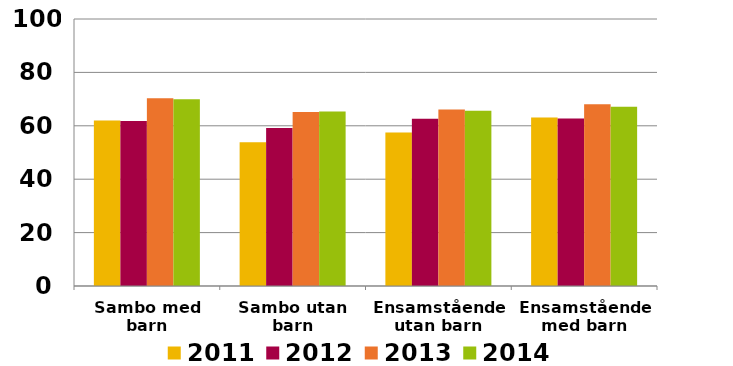
| Category | 2011 | 2012 | 2013 | 2014 |
|---|---|---|---|---|
| Sambo med barn | 61.987 | 61.78 | 70.301 | 69.963 |
| Sambo utan barn | 53.849 | 59.134 | 65.212 | 65.381 |
| Ensamstående utan barn | 57.516 | 62.622 | 66.143 | 65.679 |
| Ensamstående med barn | 63.155 | 62.76 | 68.107 | 67.094 |